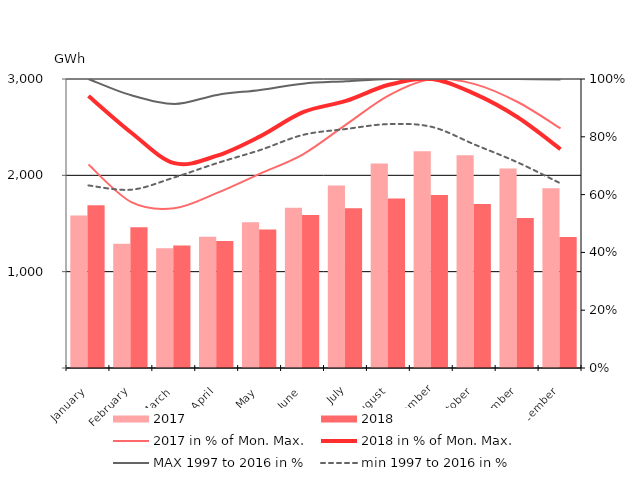
| Category | 2017 | 2018 |
|---|---|---|
| January | 1582.867 | 1689.202 |
| February | 1290.72 | 1460.972 |
| March | 1243.431 | 1272.122 |
| April | 1362.845 | 1318.923 |
| May | 1512.859 | 1438.682 |
| June | 1663.254 | 1588.758 |
| July | 1893.893 | 1658.564 |
| August | 2122.171 | 1758.823 |
| September | 2249.114 | 1794.854 |
| October | 2209.313 | 1702.398 |
| November | 2070.18 | 1557.227 |
| December | 1864.785 | 1359.189 |